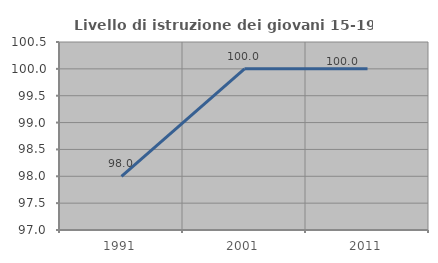
| Category | Livello di istruzione dei giovani 15-19 anni |
|---|---|
| 1991.0 | 98 |
| 2001.0 | 100 |
| 2011.0 | 100 |